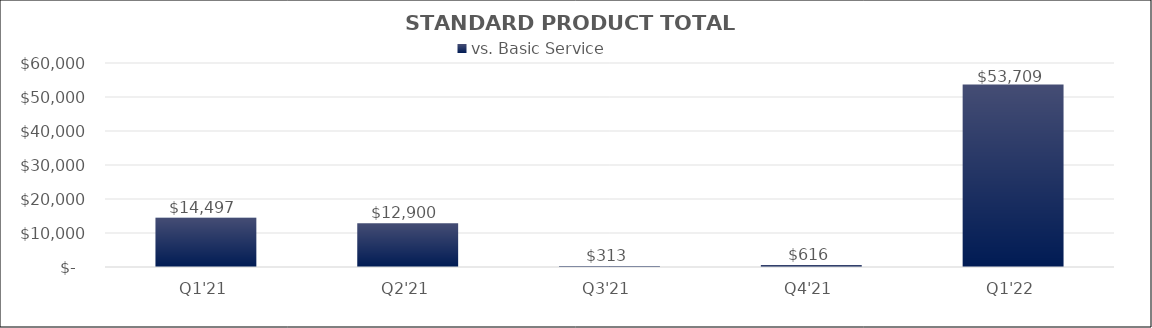
| Category | vs. Basic Service |
|---|---|
| Q1'21 | 14497.315 |
| Q2'21 | 12900.209 |
| Q3'21 | 312.535 |
| Q4'21 | 616.134 |
| Q1'22 | 53708.915 |